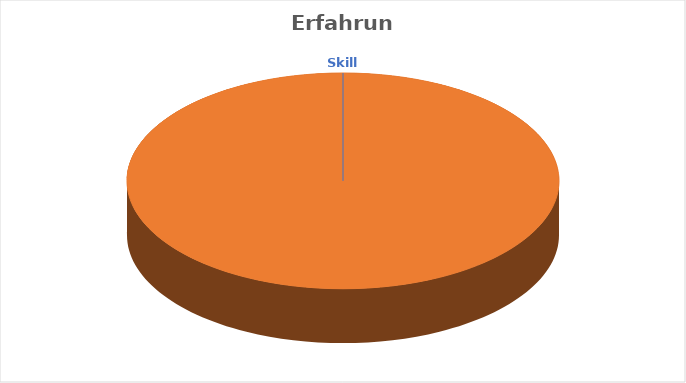
| Category | Erfahrung |
|---|---|
| .NET Core | 5.583 |
| .NET Framework | 14.583 |
| ASP.NET | 14.583 |
| Azure Functions | 5.333 |
| Azure Search | 0.917 |
| Azure SQL | 10.583 |
| Azure Storage | 7.583 |
| Azure WebJobs | 7.583 |
| C#.NET | 14.333 |
| CSS | 22.75 |
| DI | 9.25 |
| HTML | 22.75 |
| JavaScript | 22.75 |
| jQuery | 9.417 |
| JSON | 18.333 |
| LESS | 7.083 |
| LINQ | 14.083 |
| MQTT | 1.833 |
| MVC | 12.333 |
| OOP | 14.583 |
| REST | 7.833 |
| Scrum | 12.583 |
| SignalR | 1.5 |
| SOA | 12.583 |
| SQL | 18.333 |
| SQL Server | 14.333 |
| XML | 20.583 |